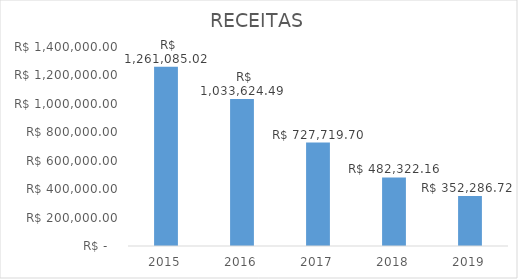
| Category | RECEITAS |
|---|---|
| 2015.0 | 1261085.02 |
| 2016.0 | 1033624.49 |
| 2017.0 | 727719.7 |
| 2018.0 | 482322.16 |
| 2019.0 | 352286.72 |